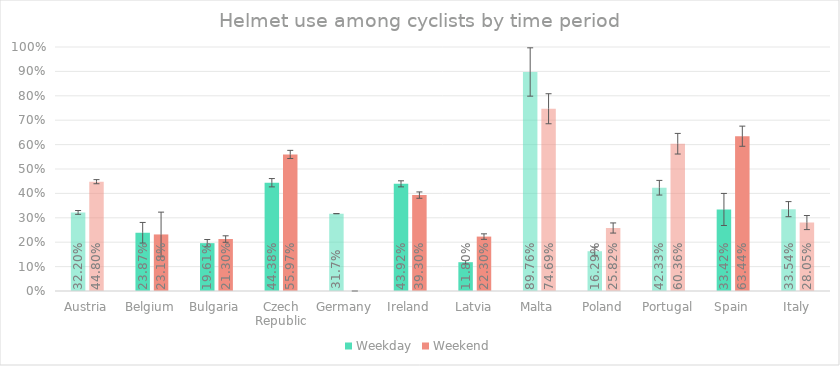
| Category | Weekday | Weekend |
|---|---|---|
| Austria | 0.322 | 0.448 |
| Belgium | 0.239 | 0.232 |
| Bulgaria | 0.196 | 0.213 |
| Czech Republic | 0.444 | 0.56 |
| Germany | 0.317 | 0 |
| Ireland | 0.439 | 0.393 |
| Latvia | 0.118 | 0.223 |
| Malta | 0.898 | 0.747 |
| Poland | 0.163 | 0.258 |
| Portugal | 0.423 | 0.604 |
| Spain | 0.334 | 0.634 |
| Italy | 0.335 | 0.28 |